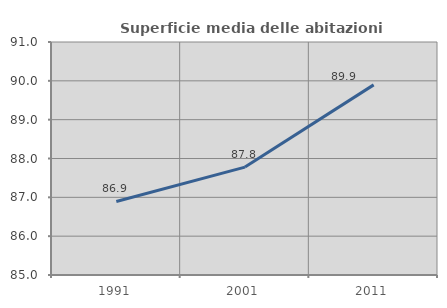
| Category | Superficie media delle abitazioni occupate |
|---|---|
| 1991.0 | 86.893 |
| 2001.0 | 87.779 |
| 2011.0 | 89.896 |